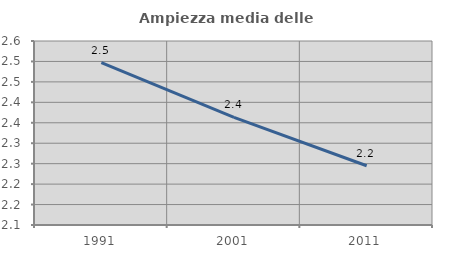
| Category | Ampiezza media delle famiglie |
|---|---|
| 1991.0 | 2.497 |
| 2001.0 | 2.363 |
| 2011.0 | 2.245 |